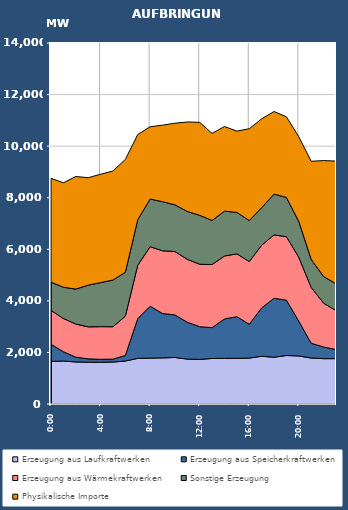
| Category | Erzeugung aus Laufkraftwerken | Erzeugung aus Speicherkraftwerken | Erzeugung aus Wärmekraftwerken | Sonstige Erzeugung | Physikalische Importe |
|---|---|---|---|---|---|
| 2007-01-17 | 1653.043 | 663.493 | 1313.155 | 1095.183 | 4027.462 |
| 2007-01-17 01:00:00 | 1666.247 | 362.028 | 1286.345 | 1212.558 | 4051.702 |
| 2007-01-17 02:00:00 | 1630.143 | 184.882 | 1286.289 | 1354.917 | 4366.738 |
| 2007-01-17 03:00:00 | 1621.582 | 129.671 | 1241.452 | 1615.989 | 4167.83 |
| 2007-01-17 04:00:00 | 1618.061 | 115.372 | 1265.711 | 1709.067 | 4202.202 |
| 2007-01-17 05:00:00 | 1627.114 | 112.043 | 1257.604 | 1810.714 | 4227.482 |
| 2007-01-17 06:00:00 | 1666.938 | 216.659 | 1522.279 | 1702.917 | 4376.47 |
| 2007-01-17 07:00:00 | 1768.422 | 1543.302 | 2068.504 | 1767.906 | 3302.33 |
| 2007-01-17 08:00:00 | 1779.216 | 2013.858 | 2308.373 | 1848.565 | 2803.37 |
| 2007-01-17 09:00:00 | 1787.141 | 1722.84 | 2431.83 | 1902.43 | 2968.638 |
| 2007-01-17 10:00:00 | 1804.058 | 1651.072 | 2457.005 | 1812.238 | 3164.41 |
| 2007-01-17 11:00:00 | 1741.367 | 1429.369 | 2439.92 | 1855.874 | 3471.042 |
| 2007-01-17 12:00:00 | 1728.979 | 1269.135 | 2421.536 | 1898.648 | 3603.978 |
| 2007-01-17 13:00:00 | 1766.228 | 1195.038 | 2448.549 | 1707.22 | 3377.457 |
| 2007-01-17 14:00:00 | 1770.969 | 1527.814 | 2439.465 | 1741.08 | 3281.423 |
| 2007-01-17 15:00:00 | 1770.096 | 1617.555 | 2436.459 | 1605.513 | 3153.254 |
| 2007-01-17 16:00:00 | 1780.692 | 1311.941 | 2432.023 | 1589.96 | 3559.334 |
| 2007-01-17 17:00:00 | 1850.683 | 1875.303 | 2430.23 | 1456.718 | 3446.026 |
| 2007-01-17 18:00:00 | 1813.262 | 2287.492 | 2458.018 | 1581.454 | 3203.694 |
| 2007-01-17 19:00:00 | 1880.743 | 2145.253 | 2462.125 | 1522.432 | 3126.506 |
| 2007-01-17 20:00:00 | 1863.553 | 1348.582 | 2476.443 | 1386.937 | 3284.806 |
| 2007-01-17 21:00:00 | 1782.613 | 573.466 | 2163.261 | 1090.457 | 3802.67 |
| 2007-01-17 22:00:00 | 1758.454 | 452.475 | 1698.844 | 1034.026 | 4496.706 |
| 2007-01-17 23:00:00 | 1758.581 | 353.652 | 1510.517 | 1039.37 | 4757.994 |